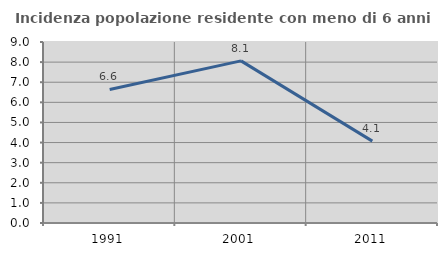
| Category | Incidenza popolazione residente con meno di 6 anni |
|---|---|
| 1991.0 | 6.638 |
| 2001.0 | 8.06 |
| 2011.0 | 4.071 |